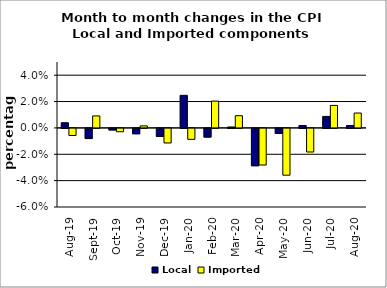
| Category | Local | Imported |
|---|---|---|
| 2019-08-01 | 0.004 | -0.005 |
| 2019-09-01 | -0.008 | 0.009 |
| 2019-10-01 | -0.001 | -0.003 |
| 2019-11-01 | -0.004 | 0.002 |
| 2019-12-01 | -0.006 | -0.011 |
| 2020-01-01 | 0.025 | -0.008 |
| 2020-02-01 | -0.007 | 0.02 |
| 2020-03-01 | 0.001 | 0.009 |
| 2020-04-01 | -0.028 | -0.028 |
| 2020-05-01 | -0.004 | -0.035 |
| 2020-06-01 | 0.002 | -0.018 |
| 2020-07-01 | 0.009 | 0.017 |
| 2020-08-01 | 0.002 | 0.011 |